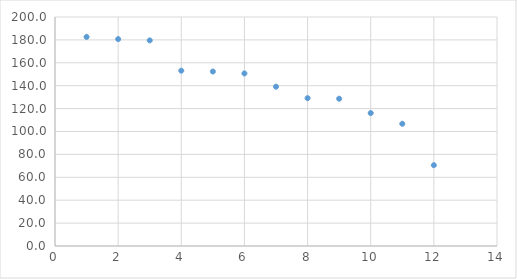
| Category | Series 0 |
|---|---|
| 1.0 | 182.607 |
| 2.0 | 180.702 |
| 3.0 | 179.577 |
| 4.0 | 153.106 |
| 5.0 | 152.387 |
| 6.0 | 150.715 |
| 7.0 | 139.124 |
| 8.0 | 129.115 |
| 9.0 | 128.624 |
| 10.0 | 116.102 |
| 11.0 | 106.751 |
| 12.0 | 70.598 |